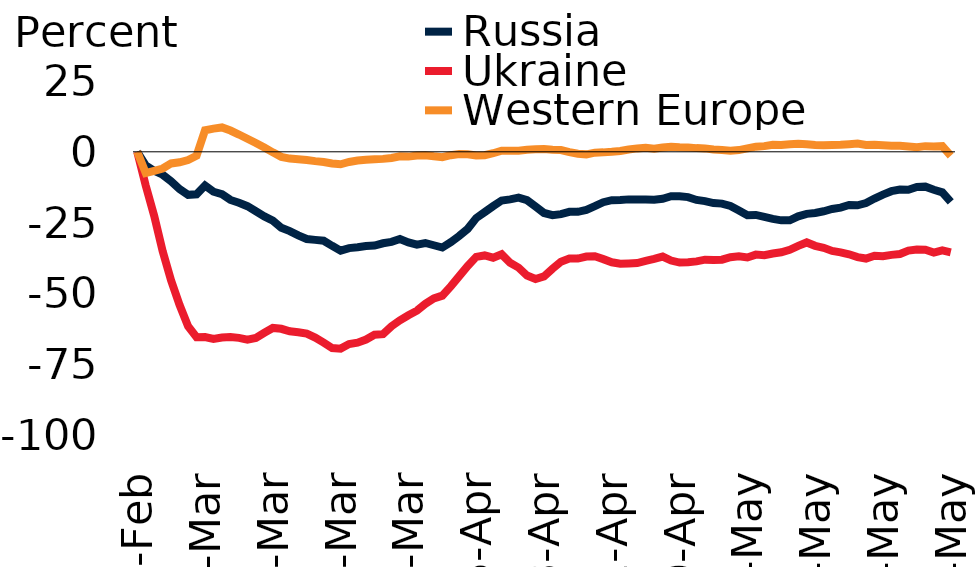
| Category | Russia | Ukraine | Western Europe |
|---|---|---|---|
| 2022-02-24 | 0 | 0 | 0 |
| 2022-02-25 | -4.8 | -11.9 | -7.5 |
| 2022-02-26 | -6.7 | -22.6 | -6.7 |
| 2022-02-27 | -8.1 | -35.1 | -5.9 |
| 2022-02-28 | -10.4 | -45.5 | -4.1 |
| 2022-03-01 | -13.2 | -54.1 | -3.7 |
| 2022-03-02 | -15.2 | -61.6 | -2.9 |
| 2022-03-03 | -15 | -65.5 | -1.4 |
| 2022-03-04 | -11.9 | -65.4 | 7.6 |
| 2022-03-05 | -14.1 | -66.1 | 8.2 |
| 2022-03-06 | -15 | -65.6 | 8.6 |
| 2022-03-07 | -17 | -65.4 | 7.5 |
| 2022-03-08 | -18 | -65.7 | 6.1 |
| 2022-03-09 | -19.2 | -66.3 | 4.6 |
| 2022-03-10 | -21 | -65.7 | 3.1 |
| 2022-03-11 | -22.8 | -63.9 | 1.5 |
| 2022-03-12 | -24.3 | -62.2 | -0.2 |
| 2022-03-13 | -26.8 | -62.5 | -1.8 |
| 2022-03-14 | -28 | -63.4 | -2.4 |
| 2022-03-15 | -29.5 | -63.7 | -2.6 |
| 2022-03-16 | -30.8 | -64.2 | -2.9 |
| 2022-03-17 | -31.1 | -65.6 | -3.3 |
| 2022-03-18 | -31.4 | -67.4 | -3.6 |
| 2022-03-19 | -33.2 | -69.3 | -4.1 |
| 2022-03-20 | -34.9 | -69.5 | -4.4 |
| 2022-03-21 | -34 | -67.9 | -3.6 |
| 2022-03-22 | -33.7 | -67.4 | -3.1 |
| 2022-03-23 | -33.3 | -66.3 | -2.8 |
| 2022-03-24 | -33.1 | -64.6 | -2.6 |
| 2022-03-25 | -32.3 | -64.4 | -2.5 |
| 2022-03-26 | -31.8 | -61.6 | -2.2 |
| 2022-03-27 | -30.8 | -59.5 | -1.6 |
| 2022-03-28 | -32 | -57.7 | -1.7 |
| 2022-03-29 | -32.8 | -56.1 | -1.3 |
| 2022-03-30 | -32.2 | -53.7 | -1.2 |
| 2022-03-31 | -33 | -51.8 | -1.6 |
| 2022-04-01 | -33.8 | -50.8 | -1.9 |
| 2022-04-02 | -31.9 | -47.5 | -1.2 |
| 2022-04-03 | -29.7 | -43.9 | -0.8 |
| 2022-04-04 | -27.2 | -40.3 | -0.9 |
| 2022-04-05 | -23.4 | -37.1 | -1.3 |
| 2022-04-06 | -21.3 | -36.6 | -1.2 |
| 2022-04-07 | -19.2 | -37.4 | -0.5 |
| 2022-04-08 | -17.2 | -36.2 | 0.4 |
| 2022-04-09 | -16.8 | -39.2 | 0.4 |
| 2022-04-10 | -16.2 | -40.9 | 0.4 |
| 2022-04-11 | -17.1 | -43.7 | 0.7 |
| 2022-04-12 | -19.3 | -44.9 | 0.9 |
| 2022-04-13 | -21.6 | -44 | 1 |
| 2022-04-14 | -22.4 | -41.3 | 0.7 |
| 2022-04-15 | -22 | -38.8 | 0.6 |
| 2022-04-16 | -21.2 | -37.7 | -0.1 |
| 2022-04-17 | -21.2 | -37.7 | -0.7 |
| 2022-04-18 | -20.5 | -37 | -0.9 |
| 2022-04-19 | -19.2 | -36.9 | -0.3 |
| 2022-04-20 | -17.8 | -37.9 | -0.2 |
| 2022-04-21 | -17.1 | -39 | 0 |
| 2022-04-22 | -17 | -39.5 | 0.3 |
| 2022-04-23 | -16.8 | -39.4 | 0.8 |
| 2022-04-24 | -16.8 | -39.3 | 1.2 |
| 2022-04-25 | -16.8 | -38.5 | 1.4 |
| 2022-04-26 | -16.9 | -37.8 | 1.1 |
| 2022-04-27 | -16.6 | -37 | 1.5 |
| 2022-04-28 | -15.7 | -38.4 | 1.8 |
| 2022-04-29 | -15.7 | -39.1 | 1.6 |
| 2022-04-30 | -16 | -39 | 1.5 |
| 2022-05-01 | -17 | -38.7 | 1.3 |
| 2022-05-02 | -17.4 | -38.1 | 1.2 |
| 2022-05-03 | -18.1 | -38.2 | 0.8 |
| 2022-05-04 | -18.3 | -38.1 | 0.6 |
| 2022-05-05 | -19.1 | -37.2 | 0.4 |
| 2022-05-06 | -20.7 | -36.9 | 0.6 |
| 2022-05-07 | -22.4 | -37.3 | 1.2 |
| 2022-05-08 | -22.3 | -36.3 | 1.8 |
| 2022-05-09 | -23 | -36.5 | 2 |
| 2022-05-10 | -23.7 | -35.9 | 2.5 |
| 2022-05-11 | -24.2 | -35.5 | 2.4 |
| 2022-05-12 | -24.2 | -34.6 | 2.7 |
| 2022-05-13 | -22.8 | -33.2 | 2.8 |
| 2022-05-14 | -21.9 | -32 | 2.7 |
| 2022-05-15 | -21.6 | -33.2 | 2.4 |
| 2022-05-16 | -21 | -33.9 | 2.3 |
| 2022-05-17 | -20.2 | -35 | 2.4 |
| 2022-05-18 | -19.7 | -35.5 | 2.5 |
| 2022-05-19 | -18.8 | -36.2 | 2.7 |
| 2022-05-20 | -18.9 | -37.2 | 2.9 |
| 2022-05-21 | -18.1 | -37.7 | 2.4 |
| 2022-05-22 | -16.5 | -36.7 | 2.5 |
| 2022-05-23 | -15.1 | -36.9 | 2.3 |
| 2022-05-24 | -13.9 | -36.4 | 2.1 |
| 2022-05-25 | -13.3 | -36.1 | 2.1 |
| 2022-05-26 | -13.4 | -34.9 | 1.9 |
| 2022-05-27 | -12.4 | -34.5 | 1.6 |
| 2022-05-28 | -12.3 | -34.6 | 2 |
| 2022-05-29 | -13.4 | -35.6 | 1.9 |
| 2022-05-30 | -14.3 | -34.8 | 2 |
| 2022-05-31 | -17.7 | -35.5 | -1.4 |